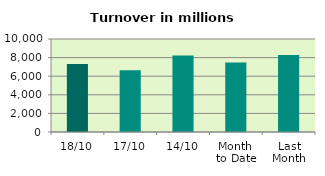
| Category | Series 0 |
|---|---|
| 18/10 | 7299.573 |
| 17/10 | 6652.036 |
| 14/10 | 8223.648 |
| Month 
to Date | 7479.295 |
| Last
Month | 8284.199 |